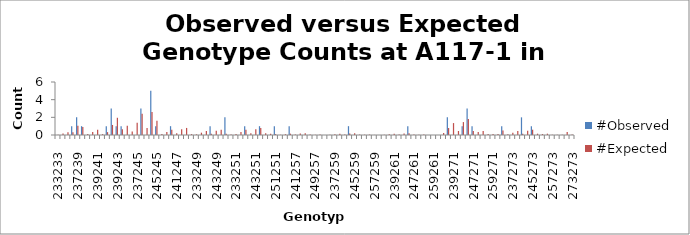
| Category | #Observed | #Expected |
|---|---|---|
| 233233.0 | 0 | 0.025 |
| 233237.0 | 0 | 0.175 |
| 237237.0 | 0 | 0.306 |
| 233239.0 | 1 | 0.3 |
| 237239.0 | 2 | 1.05 |
| 239239.0 | 1 | 0.9 |
| 233241.0 | 0 | 0.1 |
| 237241.0 | 0 | 0.35 |
| 239241.0 | 0 | 0.6 |
| 241241.0 | 0 | 0.1 |
| 233243.0 | 1 | 0.325 |
| 237243.0 | 3 | 1.138 |
| 239243.0 | 1 | 1.95 |
| 241243.0 | 1 | 0.65 |
| 243243.0 | 0 | 1.056 |
| 233245.0 | 0 | 0.4 |
| 237245.0 | 0 | 1.4 |
| 239245.0 | 3 | 2.4 |
| 241245.0 | 0 | 0.8 |
| 243245.0 | 5 | 2.6 |
| 245245.0 | 1 | 1.6 |
| 233247.0 | 0 | 0.1 |
| 237247.0 | 0 | 0.35 |
| 239247.0 | 1 | 0.6 |
| 241247.0 | 0 | 0.2 |
| 243247.0 | 0 | 0.65 |
| 245247.0 | 0 | 0.8 |
| 247247.0 | 0 | 0.1 |
| 233249.0 | 0 | 0.075 |
| 237249.0 | 0 | 0.262 |
| 239249.0 | 0 | 0.45 |
| 241249.0 | 1 | 0.15 |
| 243249.0 | 0 | 0.488 |
| 245249.0 | 0 | 0.6 |
| 247249.0 | 2 | 0.15 |
| 249249.0 | 0 | 0.056 |
| 233251.0 | 0 | 0.1 |
| 237251.0 | 0 | 0.35 |
| 239251.0 | 1 | 0.6 |
| 241251.0 | 0 | 0.2 |
| 243251.0 | 0 | 0.65 |
| 245251.0 | 1 | 0.8 |
| 247251.0 | 0 | 0.2 |
| 249251.0 | 0 | 0.15 |
| 251251.0 | 1 | 0.1 |
| 233257.0 | 0 | 0.025 |
| 237257.0 | 0 | 0.088 |
| 239257.0 | 1 | 0.15 |
| 241257.0 | 0 | 0.05 |
| 243257.0 | 0 | 0.162 |
| 245257.0 | 0 | 0.2 |
| 247257.0 | 0 | 0.05 |
| 249257.0 | 0 | 0.038 |
| 251257.0 | 0 | 0.05 |
| 257257.0 | 0 | 0.006 |
| 233259.0 | 0 | 0.025 |
| 237259.0 | 0 | 0.088 |
| 239259.0 | 0 | 0.15 |
| 241259.0 | 0 | 0.05 |
| 243259.0 | 1 | 0.162 |
| 245259.0 | 0 | 0.2 |
| 247259.0 | 0 | 0.05 |
| 249259.0 | 0 | 0.038 |
| 251259.0 | 0 | 0.05 |
| 257259.0 | 0 | 0.012 |
| 259259.0 | 0 | 0.006 |
| 233261.0 | 0 | 0.025 |
| 237261.0 | 0 | 0.088 |
| 239261.0 | 0 | 0.15 |
| 241261.0 | 0 | 0.05 |
| 243261.0 | 0 | 0.162 |
| 245261.0 | 1 | 0.2 |
| 247261.0 | 0 | 0.05 |
| 249261.0 | 0 | 0.038 |
| 251261.0 | 0 | 0.05 |
| 257261.0 | 0 | 0.012 |
| 259261.0 | 0 | 0.012 |
| 261261.0 | 0 | 0.006 |
| 233271.0 | 0 | 0.225 |
| 237271.0 | 2 | 0.788 |
| 239271.0 | 0 | 1.35 |
| 241271.0 | 0 | 0.45 |
| 243271.0 | 1 | 1.462 |
| 245271.0 | 3 | 1.8 |
| 247271.0 | 1 | 0.45 |
| 249271.0 | 0 | 0.338 |
| 251271.0 | 0 | 0.45 |
| 257271.0 | 0 | 0.112 |
| 259271.0 | 0 | 0.112 |
| 261271.0 | 0 | 0.112 |
| 271271.0 | 1 | 0.506 |
| 233273.0 | 0 | 0.075 |
| 237273.0 | 0 | 0.262 |
| 239273.0 | 0 | 0.45 |
| 241273.0 | 2 | 0.15 |
| 243273.0 | 0 | 0.488 |
| 245273.0 | 1 | 0.6 |
| 247273.0 | 0 | 0.15 |
| 249273.0 | 0 | 0.112 |
| 251273.0 | 0 | 0.15 |
| 257273.0 | 0 | 0.038 |
| 259273.0 | 0 | 0.038 |
| 261273.0 | 0 | 0.038 |
| 271273.0 | 0 | 0.338 |
| 273273.0 | 0 | 0.056 |